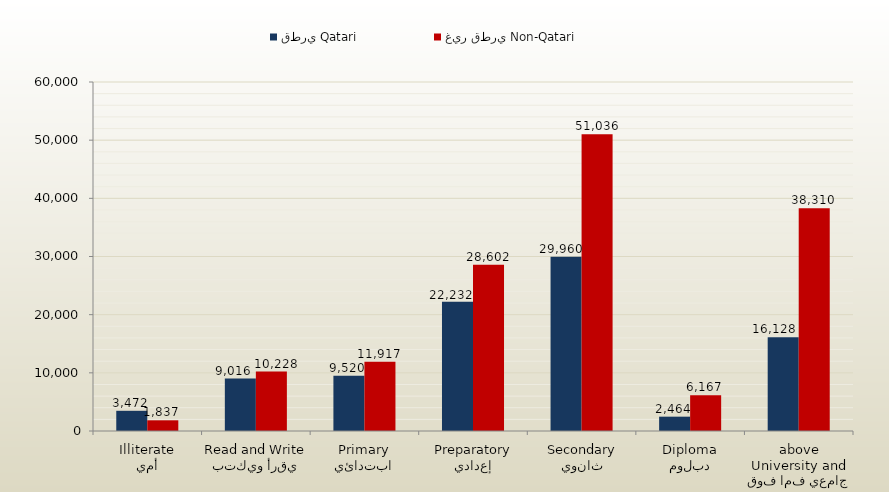
| Category | قطري Qatari | غير قطري Non-Qatari |
|---|---|---|
| أمي
Illiterate | 3472 | 1837 |
| يقرأ ويكتب
Read and Write | 9016 | 10228 |
| ابتدائي
Primary | 9520 | 11917 |
| إعدادي
Preparatory | 22232 | 28602 |
| ثانوي
Secondary | 29960 | 51036 |
| دبلوم
Diploma | 2464 | 6167 |
| جامعي فما فوق
University and above | 16128 | 38310 |